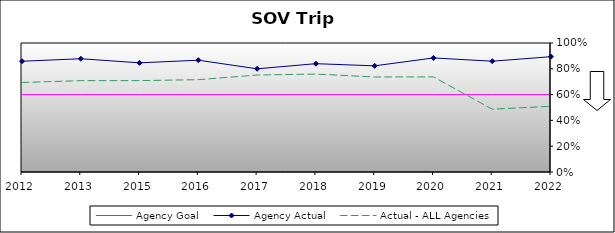
| Category | Agency Goal | Agency Actual | Actual - ALL Agencies |
|---|---|---|---|
| 2012.0 | 0.6 | 0.858 | 0.694 |
| 2013.0 | 0.6 | 0.878 | 0.708 |
| 2015.0 | 0.6 | 0.846 | 0.708 |
| 2016.0 | 0.6 | 0.867 | 0.716 |
| 2017.0 | 0.6 | 0.8 | 0.752 |
| 2018.0 | 0.6 | 0.84 | 0.759 |
| 2019.0 | 0.6 | 0.823 | 0.736 |
| 2020.0 | 0.6 | 0.884 | 0.737 |
| 2021.0 | 0.6 | 0.859 | 0.487 |
| 2022.0 | 0.6 | 0.894 | 0.509 |